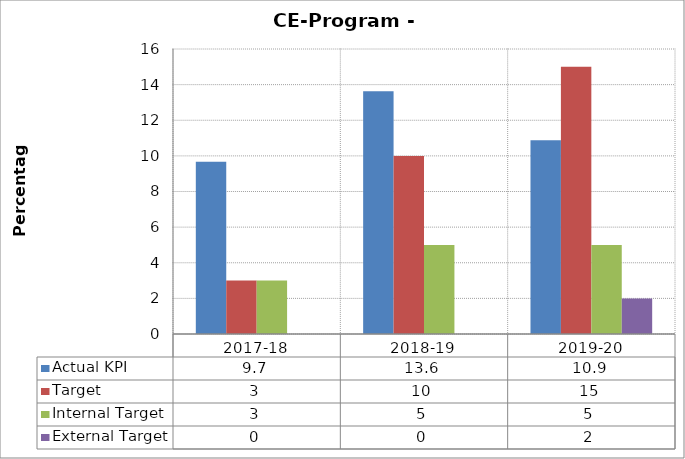
| Category | Actual KPI | Target  | Internal Target | External Target  |
|---|---|---|---|---|
| 2017-18 | 9.667 | 3 | 3 | 0 |
| 2018-19 | 13.625 | 10 | 5 | 0 |
| 2019-20 | 10.875 | 15 | 5 | 2 |